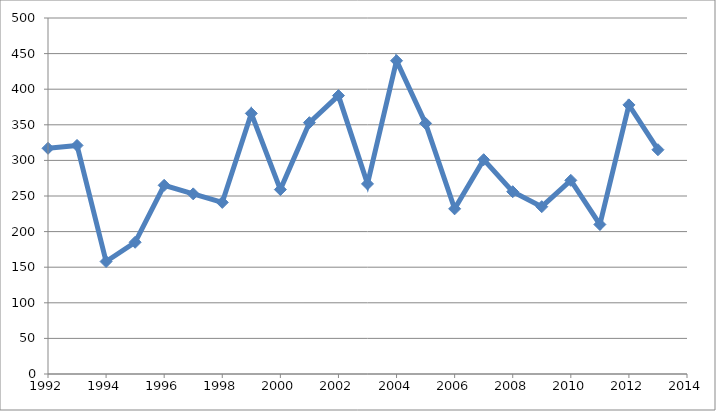
| Category | Series 0 |
|---|---|
| 1992.0 | 317 |
| 1993.0 | 321 |
| 1994.0 | 158 |
| 1995.0 | 185 |
| 1996.0 | 265 |
| 1997.0 | 253 |
| 1998.0 | 241 |
| 1999.0 | 366 |
| 2000.0 | 259 |
| 2001.0 | 353 |
| 2002.0 | 391 |
| 2003.0 | 267 |
| 2004.0 | 440 |
| 2005.0 | 352 |
| 2006.0 | 232 |
| 2007.0 | 301 |
| 2008.0 | 256 |
| 2009.0 | 235 |
| 2010.0 | 272 |
| 2011.0 | 210 |
| 2012.0 | 378 |
| 2013.0 | 315 |